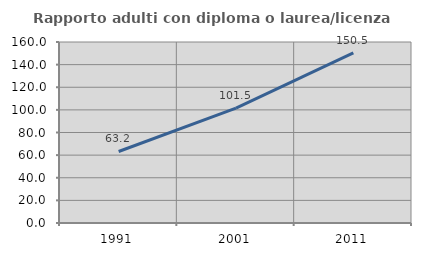
| Category | Rapporto adulti con diploma o laurea/licenza media  |
|---|---|
| 1991.0 | 63.229 |
| 2001.0 | 101.523 |
| 2011.0 | 150.473 |